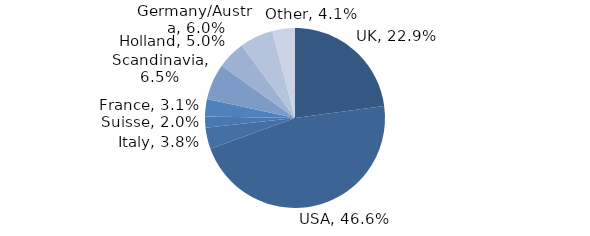
| Category | Investment Style |
|---|---|
| UK | 0.229 |
| USA | 0.466 |
| Italy | 0.038 |
| Suisse | 0.02 |
| France | 0.031 |
| Scandinavia | 0.065 |
| Holland | 0.05 |
| Germany/Austria | 0.06 |
| Other | 0.041 |